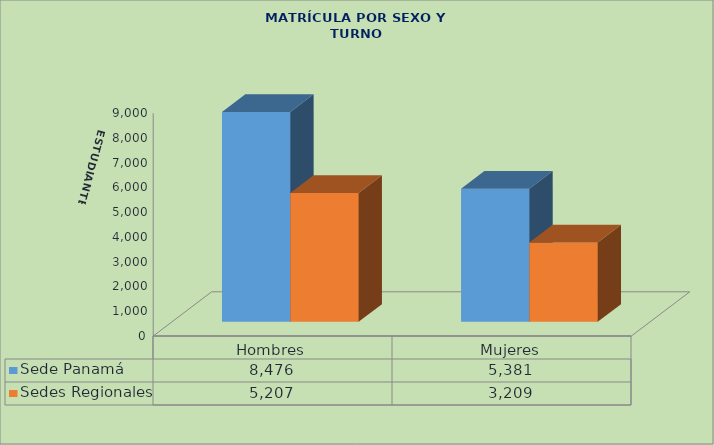
| Category | Sede Panamá | Sedes Regionales |
|---|---|---|
| 0 | 8476 | 5207 |
| 1 | 5381 | 3209 |